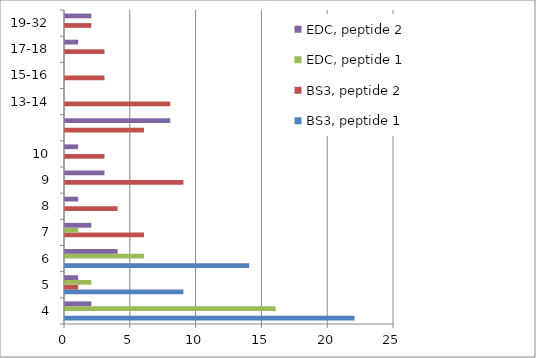
| Category | BS3, peptide 1 | BS3, peptide 2 | EDC, peptide 1 | EDC, peptide 2 |
|---|---|---|---|---|
| 4 | 22 | 0 | 16 | 2 |
| 5 | 9 | 1 | 2 | 1 |
| 6 | 14 | 0 | 6 | 4 |
| 7 | 0 | 6 | 1 | 2 |
| 8 | 0 | 4 | 0 | 1 |
| 9 | 0 | 9 | 0 | 3 |
| 10 | 0 | 3 | 0 | 1 |
|  | 0 | 6 | 0 | 8 |
| 13-14 | 0 | 8 | 0 | 0 |
| 15-16 | 0 | 3 | 0 | 0 |
| 17-18 | 0 | 3 | 0 | 1 |
| 19-32 | 0 | 2 | 0 | 2 |